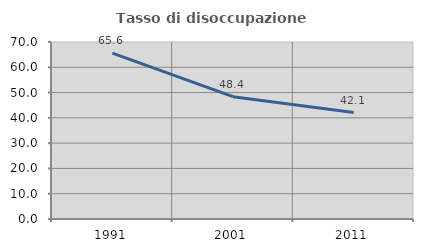
| Category | Tasso di disoccupazione giovanile  |
|---|---|
| 1991.0 | 65.625 |
| 2001.0 | 48.387 |
| 2011.0 | 42.105 |